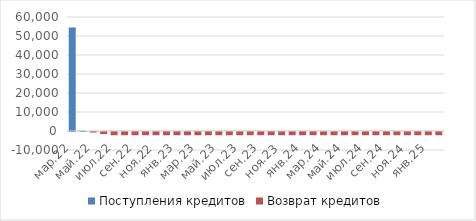
| Category | Поступления кредитов | Возврат кредитов |
|---|---|---|
| мар.22 | 54475 | 0 |
| апр.22 | 71 | 0 |
| май.22 | 0 | -300 |
| июн.22 | 0 | -1100 |
| июл.22 | 0 | -1695.052 |
| авг.22 | 0 | -1695.052 |
| сен.22 | 0 | -1695.052 |
| окт.22 | 0 | -1695.052 |
| ноя.22 | 0 | -1695.052 |
| дек.22 | 0 | -1695.052 |
| янв.23 | 0 | -1695.052 |
| фев.23 | 0 | -1695.052 |
| мар.23 | 0 | -1695.052 |
| апр.23 | 0 | -1695.052 |
| май.23 | 0 | -1695.052 |
| июн.23 | 0 | -1695.052 |
| июл.23 | 0 | -1695.052 |
| авг.23 | 0 | -1695.052 |
| сен.23 | 0 | -1695.052 |
| окт.23 | 0 | -1695.052 |
| ноя.23 | 0 | -1695.052 |
| дек.23 | 0 | -1695.052 |
| янв.24 | 0 | -1695.052 |
| фев.24 | 0 | -1695.052 |
| мар.24 | 0 | -1695.052 |
| апр.24 | 0 | -1695.052 |
| май.24 | 0 | -1695.052 |
| июн.24 | 0 | -1695.052 |
| июл.24 | 0 | -1695.052 |
| авг.24 | 0 | -1695.052 |
| сен.24 | 0 | -1695.052 |
| окт.24 | 0 | -1695.052 |
| ноя.24 | 0 | -1695.052 |
| дек.24 | 0 | -1695.052 |
| янв.25 | 0 | -1695.052 |
| фев.25 | 0 | -1695.052 |